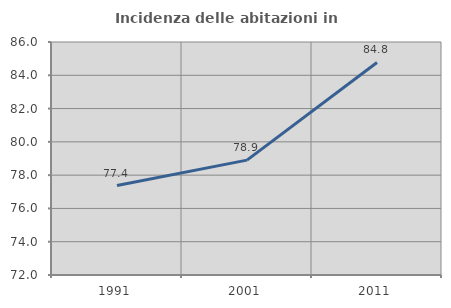
| Category | Incidenza delle abitazioni in proprietà  |
|---|---|
| 1991.0 | 77.375 |
| 2001.0 | 78.904 |
| 2011.0 | 84.772 |